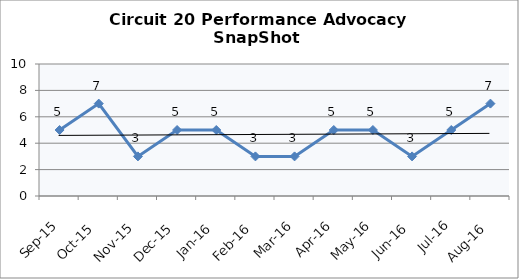
| Category | Circuit 20 |
|---|---|
| Sep-15 | 5 |
| Oct-15 | 7 |
| Nov-15 | 3 |
| Dec-15 | 5 |
| Jan-16 | 5 |
| Feb-16 | 3 |
| Mar-16 | 3 |
| Apr-16 | 5 |
| May-16 | 5 |
| Jun-16 | 3 |
| Jul-16 | 5 |
| Aug-16 | 7 |